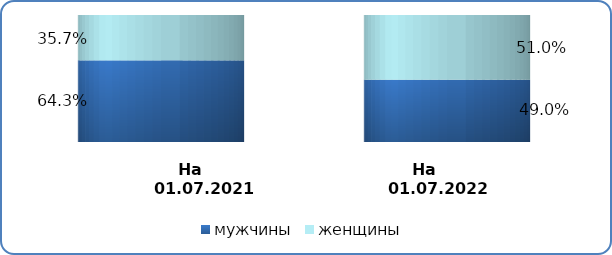
| Category | мужчины | женщины |
|---|---|---|
| на 
01.07.2021 | 0.643 | 0.357 |
| на 
01.07.2022 | 0.49 | 0.51 |